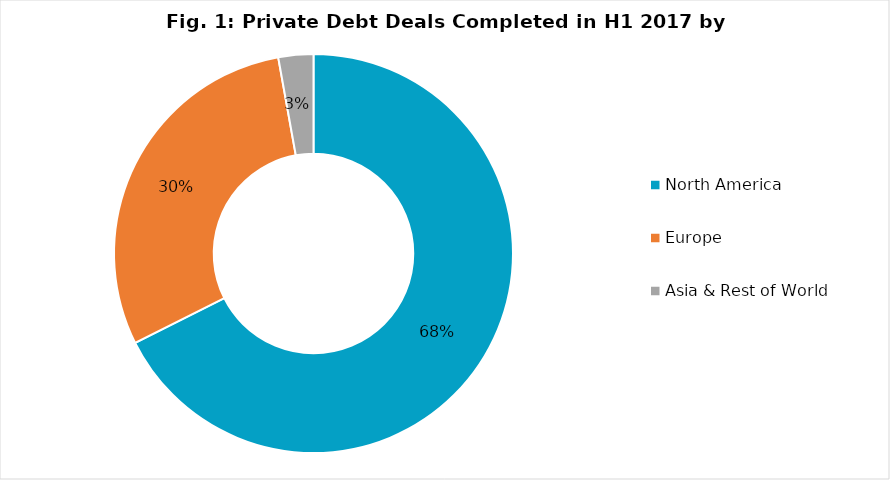
| Category | Series 0 |
|---|---|
| North America | 0.676 |
| Europe | 0.296 |
| Asia & Rest of World | 0.028 |